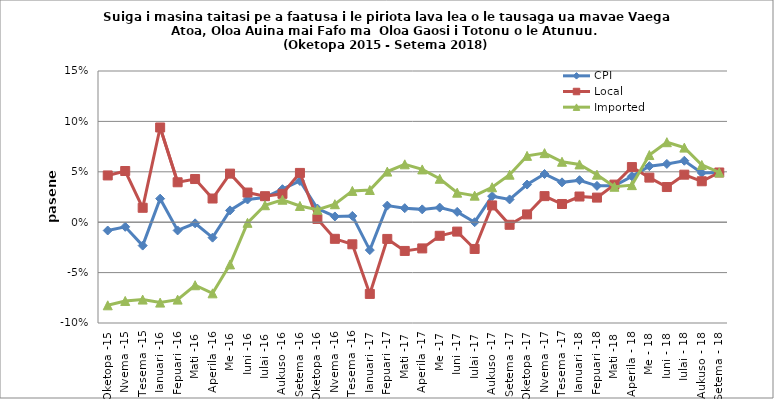
| Category | CPI | Local | Imported |
|---|---|---|---|
| Oketopa -15 | -0.008 | 0.046 | -0.082 |
| Nvema -15 | -0.005 | 0.051 | -0.078 |
| Tesema -15 | -0.023 | 0.014 | -0.077 |
| Ianuari -16 | 0.023 | 0.094 | -0.08 |
| Fepuari -16 | -0.008 | 0.04 | -0.077 |
| Mati -16 | -0.001 | 0.043 | -0.063 |
| Aperila -16 | -0.015 | 0.023 | -0.071 |
| Me -16 | 0.012 | 0.048 | -0.042 |
| Iuni -16 | 0.023 | 0.029 | -0.001 |
| Iulai -16 | 0.025 | 0.026 | 0.017 |
| Aukuso -16 | 0.033 | 0.028 | 0.022 |
| Setema -16 | 0.041 | 0.049 | 0.016 |
| Oketopa -16 | 0.014 | 0.003 | 0.012 |
| Nvema -16 | 0.006 | -0.016 | 0.018 |
| Tesema -16 | 0.006 | -0.022 | 0.031 |
| Ianuari -17 | -0.028 | -0.071 | 0.032 |
| Fepuari -17 | 0.016 | -0.017 | 0.05 |
| Mati -17 | 0.014 | -0.029 | 0.057 |
| Aperila -17 | 0.013 | -0.026 | 0.052 |
| Me -17 | 0.015 | -0.013 | 0.043 |
| Iuni -17 | 0.01 | -0.009 | 0.029 |
| Iulai -17 | 0 | -0.027 | 0.026 |
| Aukuso -17 | 0.026 | 0.017 | 0.035 |
| Setema -17 | 0.023 | -0.003 | 0.047 |
| Oketopa -17 | 0.037 | 0.008 | 0.066 |
| Nvema -17 | 0.048 | 0.026 | 0.069 |
| Tesema -17 | 0.04 | 0.018 | 0.06 |
| Ianuari -18 | 0.042 | 0.025 | 0.057 |
| Fepuari -18 | 0.036 | 0.024 | 0.047 |
| Mati -18 | 0.036 | 0.037 | 0.035 |
| Aperila - 18 | 0.045 | 0.055 | 0.037 |
| Me - 18 | 0.056 | 0.044 | 0.067 |
| Iuni - 18 | 0.058 | 0.035 | 0.079 |
| Iulai - 18 | 0.061 | 0.047 | 0.074 |
| Aukuso - 18 | 0.049 | 0.041 | 0.057 |
| Setema - 18 | 0.049 | 0.049 | 0.049 |